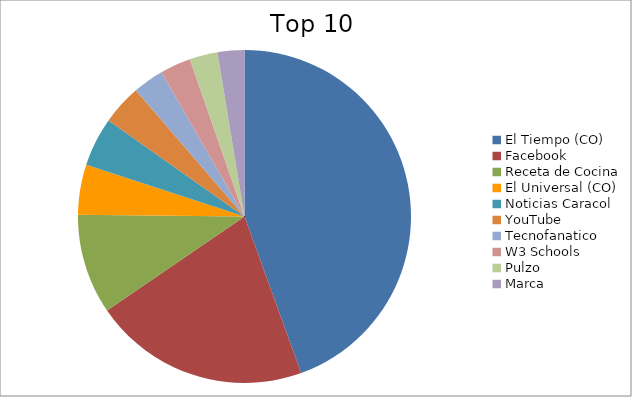
| Category | Series 0 |
|---|---|
| El Tiempo (CO) | 22.75 |
| Facebook | 10.73 |
| Receta de Cocina | 4.97 |
| El Universal (CO) | 2.49 |
| Noticias Caracol | 2.43 |
| YouTube | 1.99 |
| Tecnofanatico | 1.54 |
| W3 Schools | 1.53 |
| Pulzo | 1.39 |
| Marca | 1.33 |